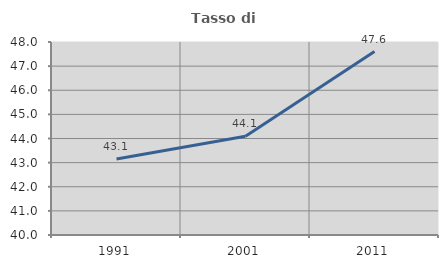
| Category | Tasso di occupazione   |
|---|---|
| 1991.0 | 43.148 |
| 2001.0 | 44.093 |
| 2011.0 | 47.603 |